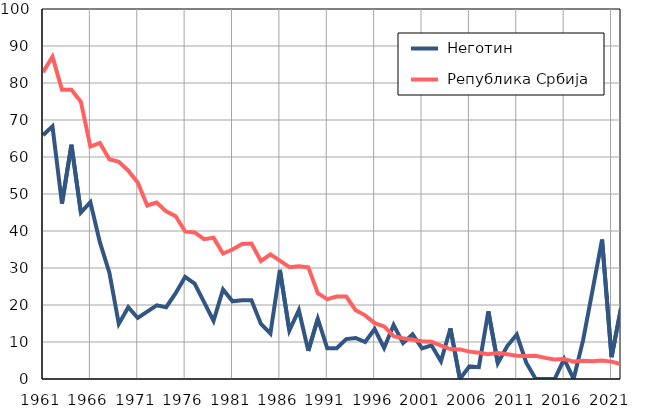
| Category |  Неготин |  Република Србија |
|---|---|---|
| 1961.0 | 65.9 | 82.9 |
| 1962.0 | 68.3 | 87.1 |
| 1963.0 | 47.4 | 78.2 |
| 1964.0 | 63.3 | 78.2 |
| 1965.0 | 45 | 74.9 |
| 1966.0 | 47.8 | 62.8 |
| 1967.0 | 37 | 63.8 |
| 1968.0 | 28.8 | 59.4 |
| 1969.0 | 14.9 | 58.7 |
| 1970.0 | 19.4 | 56.3 |
| 1971.0 | 16.5 | 53.1 |
| 1972.0 | 18.2 | 46.9 |
| 1973.0 | 19.9 | 47.7 |
| 1974.0 | 19.4 | 45.3 |
| 1975.0 | 23.2 | 44 |
| 1976.0 | 27.6 | 39.9 |
| 1977.0 | 25.8 | 39.6 |
| 1978.0 | 20.8 | 37.8 |
| 1979.0 | 15.7 | 38.2 |
| 1980.0 | 24.2 | 33.9 |
| 1981.0 | 21 | 35 |
| 1982.0 | 21.3 | 36.5 |
| 1983.0 | 21.3 | 36.6 |
| 1984.0 | 14.9 | 31.9 |
| 1985.0 | 12.3 | 33.7 |
| 1986.0 | 29.5 | 32 |
| 1987.0 | 13.1 | 30.2 |
| 1988.0 | 18.6 | 30.5 |
| 1989.0 | 7.6 | 30.2 |
| 1990.0 | 16.3 | 23.2 |
| 1991.0 | 8.3 | 21.6 |
| 1992.0 | 8.3 | 22.3 |
| 1993.0 | 10.8 | 22.3 |
| 1994.0 | 11.1 | 18.6 |
| 1995.0 | 10 | 17.2 |
| 1996.0 | 13.5 | 15.1 |
| 1997.0 | 8.4 | 14.2 |
| 1998.0 | 14.6 | 11.6 |
| 1999.0 | 9.7 | 11 |
| 2000.0 | 12.1 | 10.6 |
| 2001.0 | 8.3 | 10.2 |
| 2002.0 | 9.1 | 10.1 |
| 2003.0 | 4.8 | 9 |
| 2004.0 | 13.7 | 8.1 |
| 2005.0 | 0 | 8 |
| 2006.0 | 3.4 | 7.4 |
| 2007.0 | 3.2 | 7.1 |
| 2008.0 | 18.3 | 6.7 |
| 2009.0 | 4.3 | 7 |
| 2010.0 | 8.9 | 6.7 |
| 2011.0 | 12 | 6.3 |
| 2012.0 | 4.4 | 6.2 |
| 2013.0 | 0 | 6.3 |
| 2014.0 | 0 | 5.7 |
| 2015.0 | 0 | 5.3 |
| 2016.0 | 5.4 | 5.4 |
| 2017.0 | 0 | 4.7 |
| 2018.0 | 10.5 | 4.9 |
| 2019.0 | 24 | 4.8 |
| 2020.0 | 37.7 | 5 |
| 2021.0 | 5.9 | 4.7 |
| 2022.0 | 19.1 | 4 |